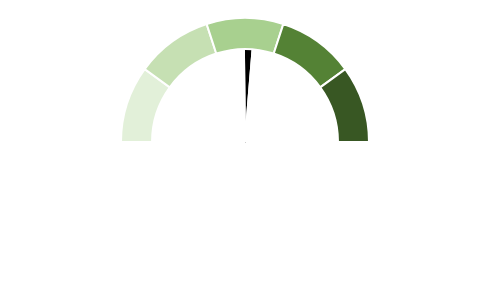
| Category | Series 1 |
|---|---|
| 0 | 50 |
| 1 | 3 |
| 2 | 148.5 |